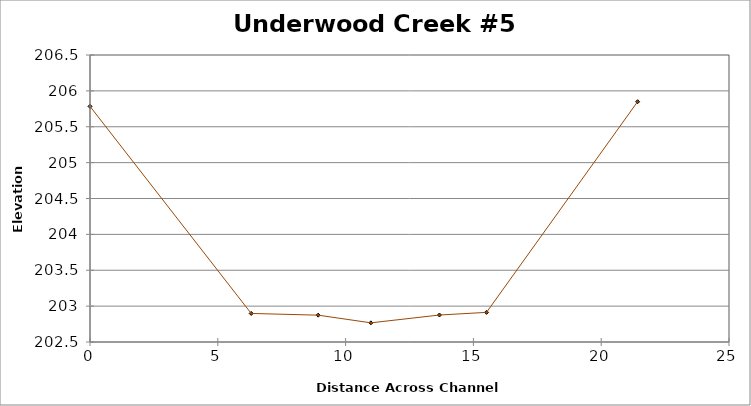
| Category | Series 0 |
|---|---|
| 0.0 | 205.784 |
| 6.307062470219571 | 202.898 |
| 8.92718320652107 | 202.874 |
| 10.989655135651647 | 202.767 |
| 13.672517434681563 | 202.876 |
| 15.513612087731998 | 202.913 |
| 21.42371986874862 | 205.849 |